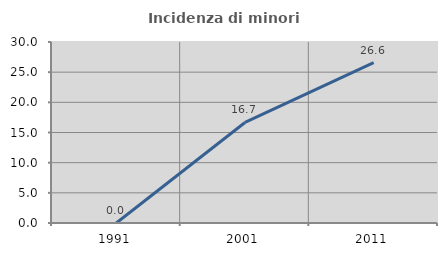
| Category | Incidenza di minori stranieri |
|---|---|
| 1991.0 | 0 |
| 2001.0 | 16.667 |
| 2011.0 | 26.582 |